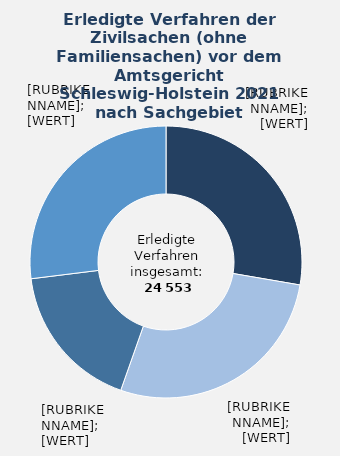
| Category | in Prozent |
|---|---|
| Sonstiger Verfahrensgegenstand | 0.277 |
| Wohnungsmietsachen | 0.277 |
| Kaufsachen | 0.177 |
| Übrige Sachgebiete¹  | 0.27 |